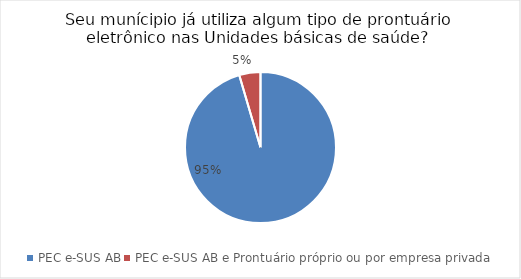
| Category | Series 0 |
|---|---|
| PEC e-SUS AB | 21 |
| PEC e-SUS AB e Prontuário próprio ou por empresa privada | 1 |